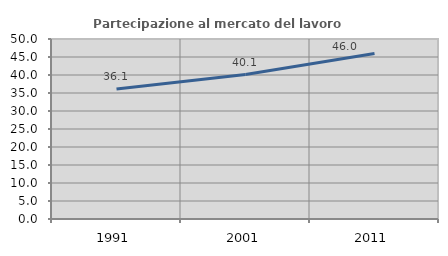
| Category | Partecipazione al mercato del lavoro  femminile |
|---|---|
| 1991.0 | 36.109 |
| 2001.0 | 40.132 |
| 2011.0 | 45.982 |